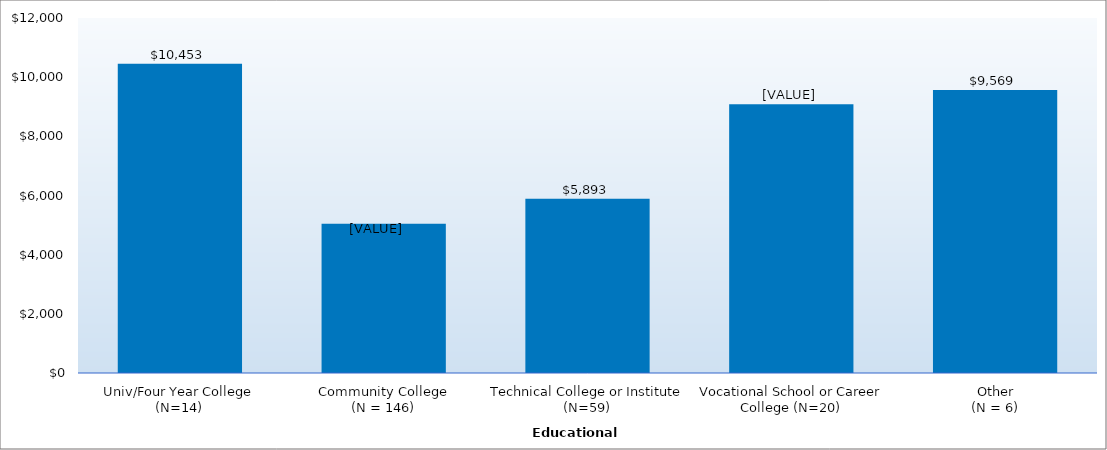
| Category | Series 0 |
|---|---|
| Univ/Four Year College (N=14) | 10453 |
| Community College
(N = 146) | 5048 |
| Technical College or Institute (N=59) | 5893 |
| Vocational School or Career College (N=20) | 9087 |
| Other
(N = 6) | 9569 |